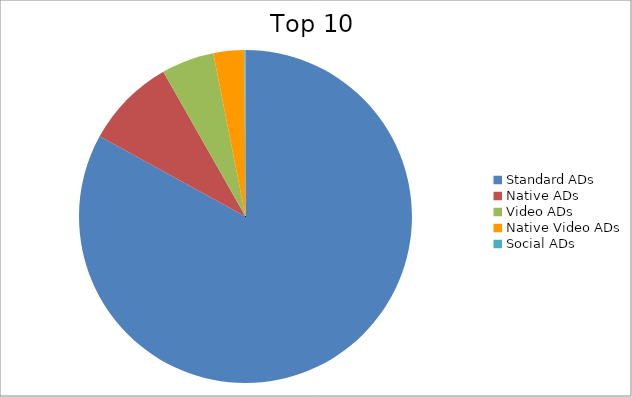
| Category | Series 0 |
|---|---|
| Standard ADs | 83 |
| Native ADs | 8.78 |
| Video ADs | 5.11 |
| Native Video ADs | 2.99 |
| Social ADs | 0.11 |